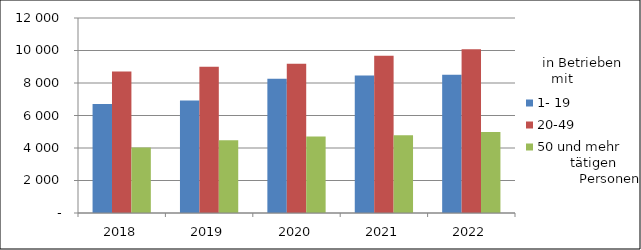
| Category | 1- 19 | 20-49 | 50 und mehr |
|---|---|---|---|
| 2018.0 | 6705 | 8702 | 4036 |
| 2019.0 | 6930 | 9003 | 4480 |
| 2020.0 | 8255 | 9178 | 4705 |
| 2021.0 | 8454 | 9679 | 4778 |
| 2022.0 | 8504 | 10084 | 4990 |